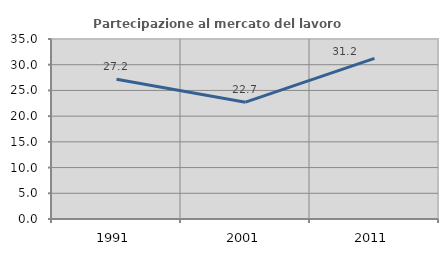
| Category | Partecipazione al mercato del lavoro  femminile |
|---|---|
| 1991.0 | 27.187 |
| 2001.0 | 22.712 |
| 2011.0 | 31.227 |